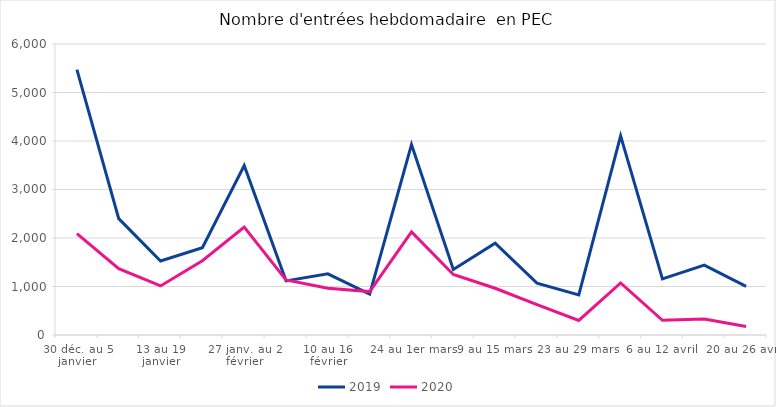
| Category | 2019 | 2020 |
|---|---|---|
| 30 déc. au 5 janvier | 5470 | 2089 |
| 6 au 12 janvier | 2400 | 1366 |
| 13 au 19 janvier | 1527 | 1012 |
| 20 au 26 janvier | 1798 | 1532 |
| 27 janv. au 2 février | 3495 | 2226 |
| 3 au 9 février | 1116 | 1134 |
| 10 au 16 février | 1260 | 962 |
| 17 au 23 février | 841 | 895 |
| 24 au 1er mars | 3928 | 2126 |
| 2 au 8 mars | 1349 | 1247 |
| 9 au 15 mars | 1893 | 964 |
| 16 au 22 mars | 1068 | 627 |
| 23 au 29 mars | 828 | 300 |
| 30 mars au 5 avril | 4105 | 1073 |
| 6 au 12 avril | 1156 | 302 |
| 13 au 19 avril | 1440 | 328 |
| 20 au 26 avril | 1002 | 175 |